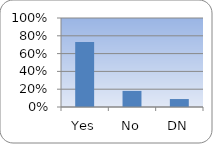
| Category | Series 0 |
|---|---|
| Yes | 0.73 |
| No | 0.181 |
| DN | 0.089 |